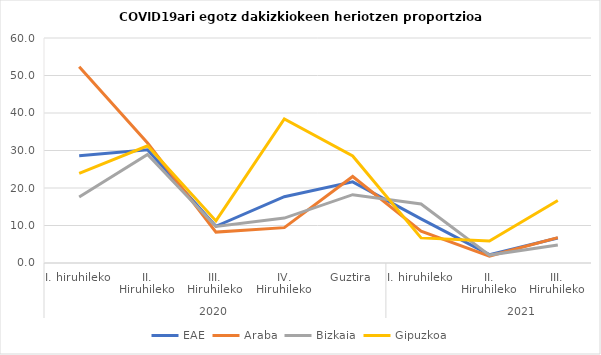
| Category | EAE | Araba | Bizkaia | Gipuzkoa |
|---|---|---|---|---|
| 0 | 28.62 | 52.326 | 17.576 | 23.913 |
| 1 | 30.168 | 32 | 28.933 | 31.237 |
| 2 | 9.789 | 8.235 | 9.726 | 11.215 |
| 3 | 17.673 | 9.434 | 11.982 | 38.403 |
| 4 | 21.636 | 23.077 | 18.212 | 28.543 |
| 5 | 11.769 | 8.497 | 15.735 | 6.697 |
| 6 | 2.239 | 1.852 | 2.11 | 5.882 |
| 7 | 6.65 | 6.757 | 4.804 | 16.667 |